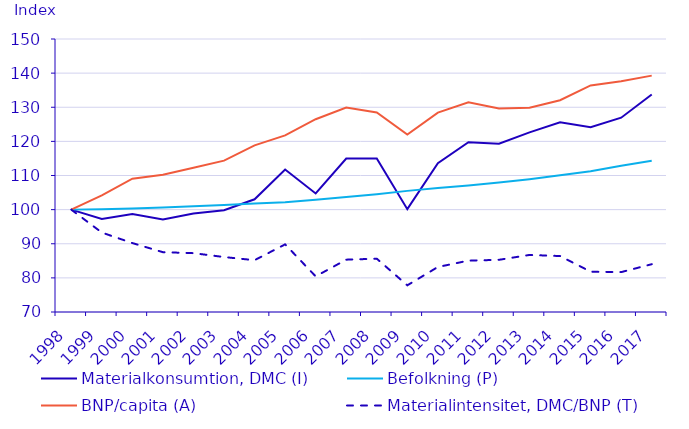
| Category | Materialkonsumtion, DMC (I) | Befolkning (P) | BNP/capita (A) | Materialintensitet, DMC/BNP (T) |
|---|---|---|---|---|
| 1998.0 | 100 | 100 | 100 | 100 |
| 1999.0 | 97.241 | 100.08 | 104.165 | 93.278 |
| 2000.0 | 98.687 | 100.322 | 109.058 | 90.201 |
| 2001.0 | 97.091 | 100.619 | 110.243 | 87.528 |
| 2002.0 | 98.892 | 100.977 | 112.257 | 87.242 |
| 2003.0 | 99.823 | 101.37 | 114.366 | 86.104 |
| 2004.0 | 103.025 | 101.774 | 118.833 | 85.186 |
| 2005.0 | 111.764 | 102.185 | 121.771 | 89.82 |
| 2006.0 | 104.732 | 102.924 | 126.498 | 80.441 |
| 2007.0 | 114.99 | 103.711 | 129.928 | 85.336 |
| 2008.0 | 114.985 | 104.54 | 128.462 | 85.622 |
| 2009.0 | 100.134 | 105.493 | 121.98 | 77.817 |
| 2010.0 | 113.618 | 106.339 | 128.43 | 83.194 |
| 2011.0 | 119.768 | 107.099 | 131.486 | 85.051 |
| 2012.0 | 119.331 | 107.923 | 129.637 | 85.292 |
| 2013.0 | 122.65 | 108.928 | 129.834 | 86.723 |
| 2014.0 | 125.596 | 110.086 | 132.053 | 86.396 |
| 2015.0 | 124.146 | 111.257 | 136.392 | 81.812 |
| 2016.0 | 126.936 | 112.884 | 137.651 | 81.69 |
| 2017.0 | 133.722 | 114.297 | 139.269 | 84.007 |